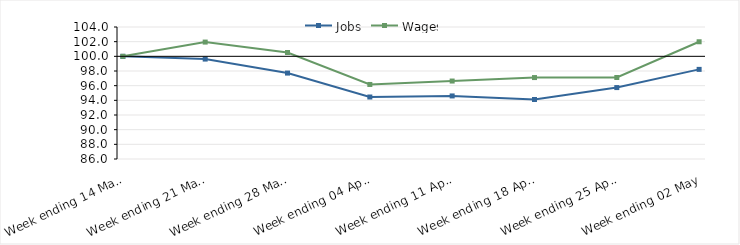
| Category | Jobs | Wages |
|---|---|---|
| 2020-03-14 | 100 | 100 |
| 2020-03-21 | 99.626 | 101.942 |
| 2020-03-28 | 97.717 | 100.525 |
| 2020-04-04 | 94.455 | 96.164 |
| 2020-04-11 | 94.599 | 96.631 |
| 2020-04-18 | 94.116 | 97.105 |
| 2020-04-25 | 95.74 | 97.112 |
| 2020-05-02 | 98.221 | 101.986 |